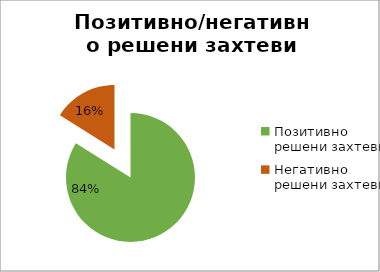
| Category | Series 0 |
|---|---|
| Позитивно решени захтеви | 24622 |
| Негативно решени захтеви | 4716 |